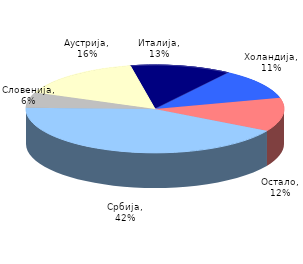
| Category | Series 0 |
|---|---|
| Србија | 0.421 |
| Словенија | 0.057 |
| Аустрија | 0.158 |
| Италија | 0.127 |
| Холандија | 0.113 |
| Остало | 0.124 |